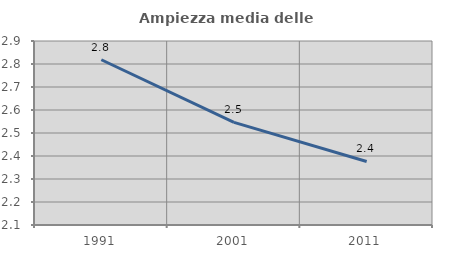
| Category | Ampiezza media delle famiglie |
|---|---|
| 1991.0 | 2.818 |
| 2001.0 | 2.546 |
| 2011.0 | 2.376 |